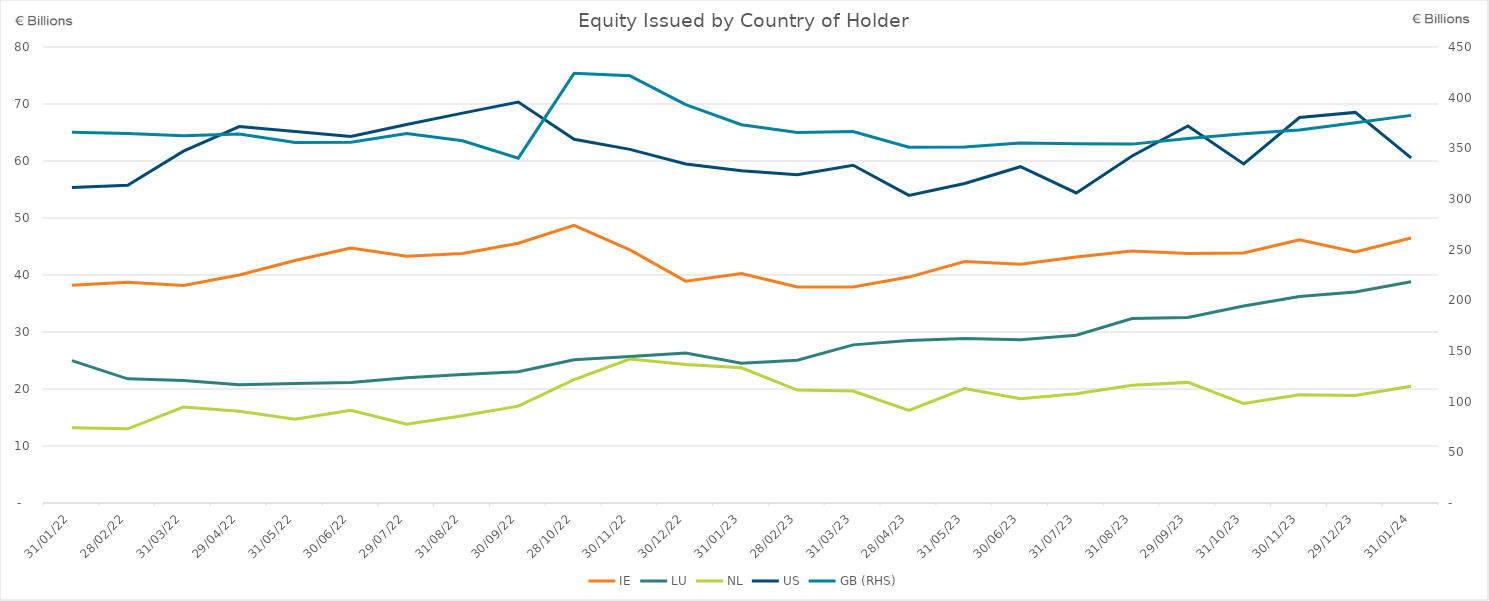
| Category | IE | LU | NL | US |
|---|---|---|---|---|
| 2022-01-31 | 38.188 | 24.98 | 13.2 | 55.338 |
| 2022-02-28 | 38.722 | 21.779 | 13.016 | 55.744 |
| 2022-03-31 | 38.166 | 21.502 | 16.839 | 61.736 |
| 2022-04-29 | 40.005 | 20.731 | 16.096 | 66.032 |
| 2022-05-31 | 42.553 | 20.969 | 14.714 | 65.157 |
| 2022-06-30 | 44.735 | 21.129 | 16.257 | 64.309 |
| 2022-07-29 | 43.293 | 21.984 | 13.815 | 66.414 |
| 2022-08-31 | 43.761 | 22.524 | 15.31 | 68.4 |
| 2022-09-30 | 45.579 | 23.046 | 16.99 | 70.341 |
| 2022-10-28 | 48.696 | 25.117 | 21.66 | 63.798 |
| 2022-11-30 | 44.406 | 25.709 | 25.244 | 62.036 |
| 2022-12-30 | 38.927 | 26.318 | 24.296 | 59.466 |
| 2023-01-31 | 40.264 | 24.511 | 23.726 | 58.294 |
| 2023-02-28 | 37.888 | 25.056 | 19.812 | 57.603 |
| 2023-03-31 | 37.89 | 27.744 | 19.647 | 59.25 |
| 2023-04-28 | 39.632 | 28.502 | 16.232 | 53.973 |
| 2023-05-31 | 42.363 | 28.865 | 20.084 | 56.058 |
| 2023-06-30 | 41.903 | 28.656 | 18.31 | 59 |
| 2023-07-31 | 43.157 | 29.446 | 19.17 | 54.4 |
| 2023-08-31 | 44.222 | 32.365 | 20.667 | 60.871 |
| 2023-09-29 | 43.777 | 32.557 | 21.162 | 66.149 |
| 2023-10-31 | 43.863 | 34.553 | 17.448 | 59.491 |
| 2023-11-30 | 46.188 | 36.21 | 18.998 | 67.628 |
| 2023-12-29 | 44.059 | 37.005 | 18.848 | 68.528 |
| 2024-01-31 | 46.494 | 38.805 | 20.47 | 60.556 |